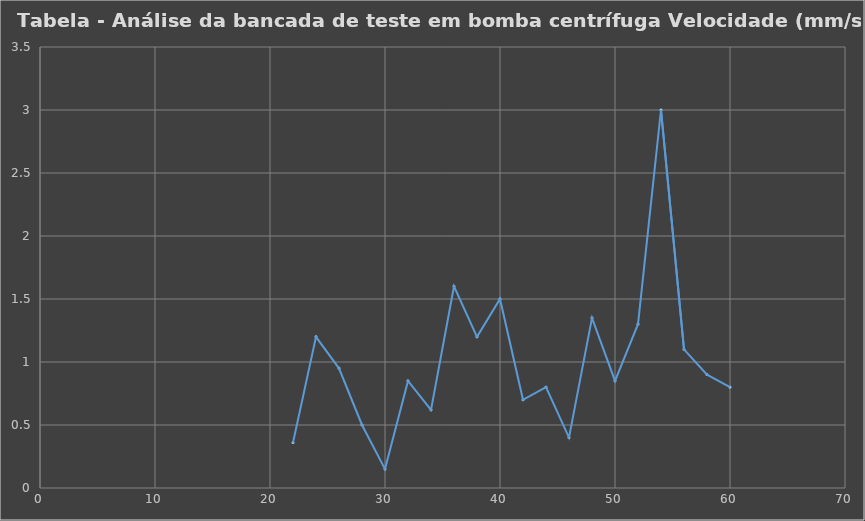
| Category | Tabela - Análise da bancada de teste em bomba centrífuga |
|---|---|
| 22.0 | 0.36 |
| 24.0 | 1.2 |
| 26.0 | 0.95 |
| 28.0 | 0.5 |
| 30.0 | 0.15 |
| 32.0 | 0.85 |
| 34.0 | 0.62 |
| 36.0 | 1.6 |
| 38.0 | 1.2 |
| 40.0 | 1.5 |
| 42.0 | 0.7 |
| 44.0 | 0.8 |
| 46.0 | 0.4 |
| 48.0 | 1.35 |
| 50.0 | 0.85 |
| 52.0 | 1.3 |
| 54.0 | 3 |
| 56.0 | 1.1 |
| 58.0 | 0.9 |
| 60.0 | 0.8 |